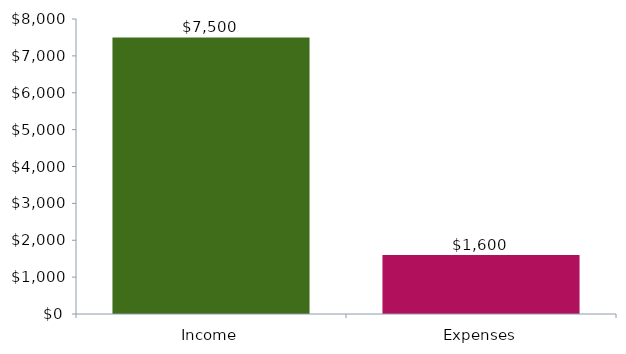
| Category | ChartData |
|---|---|
| 0 | 7500 |
| 1 | 1600 |